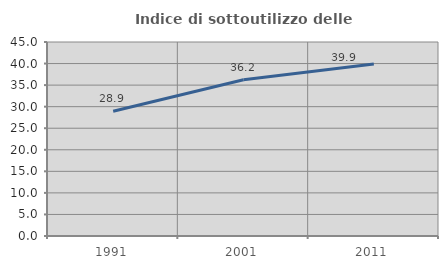
| Category | Indice di sottoutilizzo delle abitazioni  |
|---|---|
| 1991.0 | 28.944 |
| 2001.0 | 36.245 |
| 2011.0 | 39.895 |